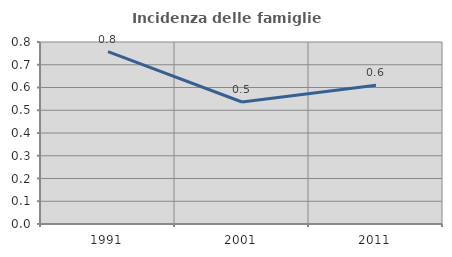
| Category | Incidenza delle famiglie numerose |
|---|---|
| 1991.0 | 0.758 |
| 2001.0 | 0.536 |
| 2011.0 | 0.61 |